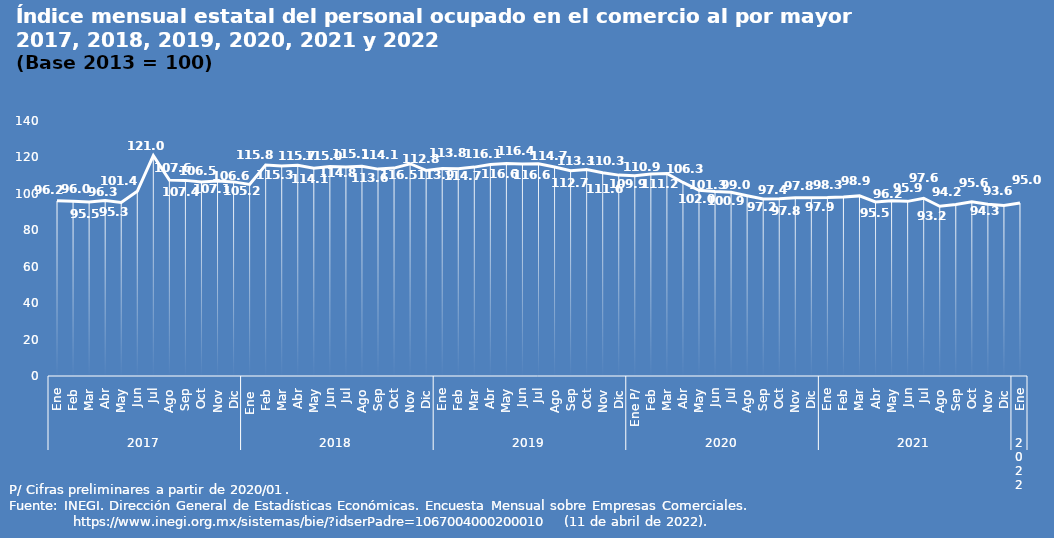
| Category | Series 0 |
|---|---|
| 0 | 96.247 |
| 1 | 95.956 |
| 2 | 95.489 |
| 3 | 96.333 |
| 4 | 95.328 |
| 5 | 101.376 |
| 6 | 121.016 |
| 7 | 107.555 |
| 8 | 107.398 |
| 9 | 106.55 |
| 10 | 107.078 |
| 11 | 106.576 |
| 12 | 105.166 |
| 13 | 115.84 |
| 14 | 115.27 |
| 15 | 115.663 |
| 16 | 114.079 |
| 17 | 114.994 |
| 18 | 114.751 |
| 19 | 115.101 |
| 20 | 113.587 |
| 21 | 114.137 |
| 22 | 116.535 |
| 23 | 112.849 |
| 24 | 113.908 |
| 25 | 113.838 |
| 26 | 114.683 |
| 27 | 116.143 |
| 28 | 116.648 |
| 29 | 116.397 |
| 30 | 116.58 |
| 31 | 114.738 |
| 32 | 112.66 |
| 33 | 113.345 |
| 34 | 111.582 |
| 35 | 110.288 |
| 36 | 109.918 |
| 37 | 110.921 |
| 38 | 111.194 |
| 39 | 106.266 |
| 40 | 101.962 |
| 41 | 101.26 |
| 42 | 100.924 |
| 43 | 98.964 |
| 44 | 97.18 |
| 45 | 97.352 |
| 46 | 97.83 |
| 47 | 97.825 |
| 48 | 97.938 |
| 49 | 98.26 |
| 50 | 98.889 |
| 51 | 95.532 |
| 52 | 96.216 |
| 53 | 95.885 |
| 54 | 97.618 |
| 55 | 93.163 |
| 56 | 94.195 |
| 57 | 95.635 |
| 58 | 94.334 |
| 59 | 93.634 |
| 60 | 94.98 |